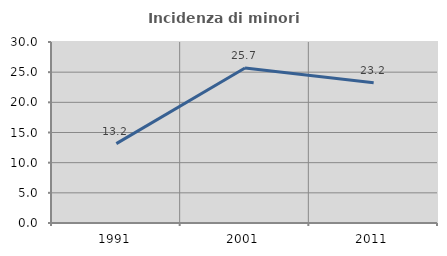
| Category | Incidenza di minori stranieri |
|---|---|
| 1991.0 | 13.158 |
| 2001.0 | 25.694 |
| 2011.0 | 23.232 |